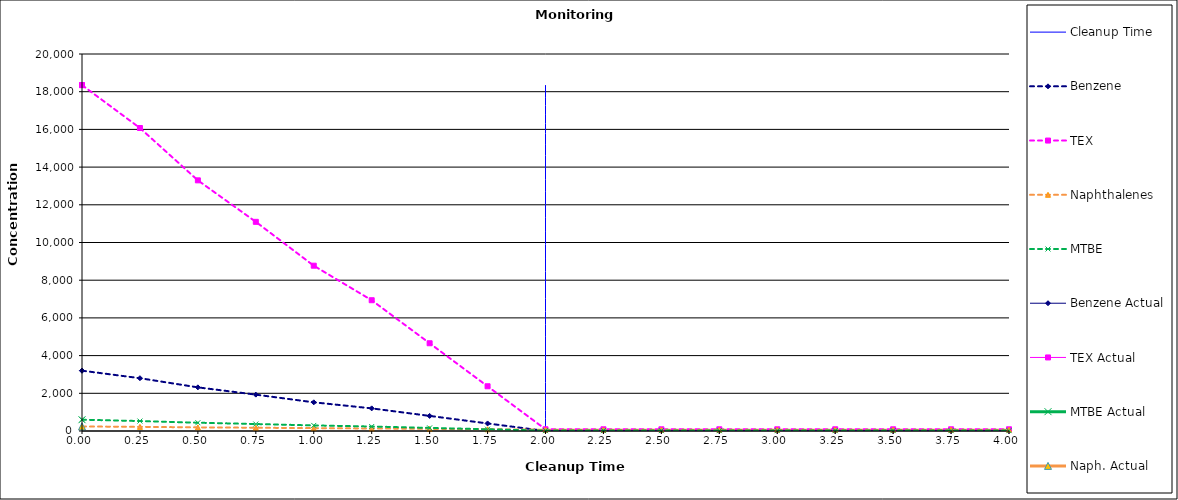
| Category | Cleanup Time |
|---|---|
| 2.0 | 0 |
| 2.0 | 18350 |